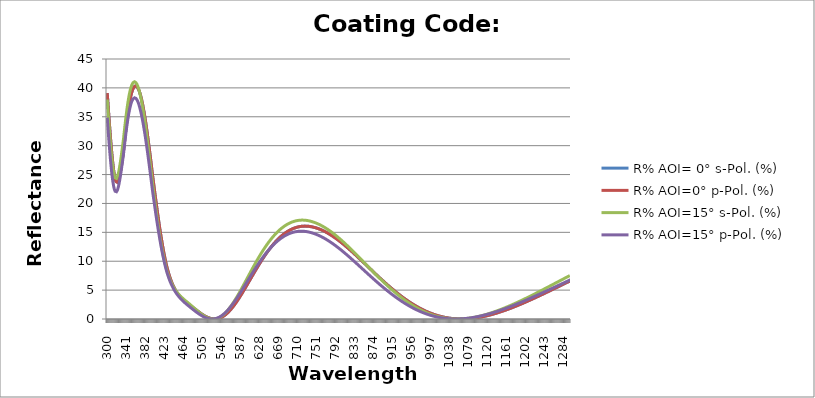
| Category | R% AOI= 0° s-Pol. (%) | R% AOI=0° p-Pol. (%) | R% AOI=15° s-Pol. (%) | R% AOI=15° p-Pol. (%) |
|---|---|---|---|---|
| 300.0 | 39.101 | 39.101 | 37.974 | 34.848 |
| 301.0 | 37.971 | 37.971 | 36.804 | 33.726 |
| 302.0 | 36.84 | 36.84 | 35.647 | 32.619 |
| 303.0 | 35.714 | 35.714 | 34.508 | 31.535 |
| 304.0 | 34.6 | 34.6 | 33.396 | 30.479 |
| 305.0 | 33.505 | 33.505 | 32.319 | 29.459 |
| 306.0 | 32.436 | 32.436 | 31.285 | 28.483 |
| 307.0 | 31.401 | 31.401 | 30.3 | 27.556 |
| 308.0 | 30.406 | 30.406 | 29.372 | 26.686 |
| 309.0 | 29.459 | 29.459 | 28.508 | 25.877 |
| 310.0 | 28.566 | 28.566 | 27.713 | 25.136 |
| 311.0 | 27.734 | 27.734 | 26.994 | 24.467 |
| 312.0 | 26.968 | 26.968 | 26.354 | 23.874 |
| 313.0 | 26.274 | 26.274 | 25.798 | 23.359 |
| 314.0 | 25.655 | 25.655 | 25.327 | 22.925 |
| 315.0 | 25.115 | 25.115 | 24.944 | 22.574 |
| 316.0 | 24.657 | 24.657 | 24.649 | 22.304 |
| 317.0 | 24.282 | 24.282 | 24.442 | 22.116 |
| 318.0 | 23.991 | 23.991 | 24.32 | 22.008 |
| 319.0 | 23.783 | 23.783 | 24.282 | 21.978 |
| 320.0 | 23.658 | 23.658 | 24.324 | 22.023 |
| 321.0 | 23.614 | 23.614 | 24.444 | 22.14 |
| 322.0 | 23.647 | 23.647 | 24.636 | 22.324 |
| 323.0 | 23.754 | 23.754 | 24.894 | 22.569 |
| 324.0 | 23.931 | 23.931 | 25.213 | 22.872 |
| 325.0 | 24.172 | 24.172 | 25.587 | 23.227 |
| 326.0 | 24.473 | 24.473 | 26.01 | 23.628 |
| 327.0 | 24.828 | 24.828 | 26.477 | 24.07 |
| 328.0 | 25.232 | 25.232 | 26.98 | 24.547 |
| 329.0 | 25.679 | 25.679 | 27.515 | 25.055 |
| 330.0 | 26.163 | 26.163 | 28.076 | 25.588 |
| 331.0 | 26.68 | 26.68 | 28.657 | 26.141 |
| 332.0 | 27.223 | 27.223 | 29.254 | 26.709 |
| 333.0 | 27.788 | 27.788 | 29.861 | 27.289 |
| 334.0 | 28.37 | 28.37 | 30.475 | 27.876 |
| 335.0 | 28.964 | 28.964 | 31.091 | 28.466 |
| 336.0 | 29.702 | 29.702 | 31.846 | 29.19 |
| 337.0 | 30.443 | 30.443 | 32.591 | 29.905 |
| 338.0 | 31.181 | 31.181 | 33.321 | 30.608 |
| 339.0 | 31.91 | 31.91 | 34.031 | 31.293 |
| 340.0 | 32.624 | 32.624 | 34.717 | 31.956 |
| 341.0 | 33.32 | 33.32 | 35.375 | 32.595 |
| 342.0 | 33.992 | 33.992 | 36.002 | 33.206 |
| 343.0 | 34.638 | 34.638 | 36.598 | 33.786 |
| 344.0 | 35.255 | 35.255 | 37.158 | 34.335 |
| 345.0 | 35.841 | 35.841 | 37.682 | 34.85 |
| 346.0 | 36.394 | 36.394 | 38.17 | 35.33 |
| 347.0 | 36.912 | 36.912 | 38.619 | 35.775 |
| 348.0 | 37.395 | 37.395 | 39.03 | 36.183 |
| 349.0 | 37.841 | 37.841 | 39.402 | 36.554 |
| 350.0 | 38.25 | 38.25 | 39.735 | 36.888 |
| 351.0 | 38.622 | 38.622 | 40.03 | 37.185 |
| 352.0 | 38.956 | 38.956 | 40.285 | 37.445 |
| 353.0 | 39.252 | 39.252 | 40.502 | 37.668 |
| 354.0 | 39.504 | 39.504 | 40.678 | 37.851 |
| 355.0 | 39.723 | 39.723 | 40.819 | 38.002 |
| 356.0 | 39.908 | 39.908 | 40.927 | 38.12 |
| 357.0 | 40.06 | 40.06 | 41.002 | 38.206 |
| 358.0 | 40.18 | 40.18 | 41.044 | 38.261 |
| 359.0 | 40.267 | 40.267 | 41.054 | 38.285 |
| 360.0 | 40.322 | 40.322 | 41.032 | 38.278 |
| 361.0 | 40.344 | 40.344 | 40.978 | 38.241 |
| 362.0 | 40.335 | 40.335 | 40.893 | 38.173 |
| 363.0 | 40.296 | 40.296 | 40.778 | 38.077 |
| 364.0 | 40.227 | 40.227 | 40.634 | 37.953 |
| 365.0 | 40.128 | 40.128 | 40.46 | 37.801 |
| 366.0 | 40.001 | 40.001 | 40.259 | 37.621 |
| 367.0 | 39.846 | 39.846 | 40.03 | 37.416 |
| 368.0 | 39.662 | 39.662 | 39.774 | 37.184 |
| 369.0 | 39.452 | 39.452 | 39.491 | 36.928 |
| 370.0 | 39.215 | 39.215 | 39.183 | 36.646 |
| 371.0 | 38.952 | 38.952 | 38.849 | 36.341 |
| 372.0 | 38.664 | 38.664 | 38.492 | 36.013 |
| 373.0 | 38.351 | 38.351 | 38.11 | 35.662 |
| 374.0 | 38.014 | 38.014 | 37.705 | 35.29 |
| 375.0 | 37.654 | 37.654 | 37.278 | 34.896 |
| 376.0 | 37.27 | 37.27 | 36.829 | 34.482 |
| 377.0 | 36.865 | 36.865 | 36.36 | 34.049 |
| 378.0 | 36.438 | 36.438 | 35.87 | 33.596 |
| 379.0 | 35.991 | 35.991 | 35.36 | 33.126 |
| 380.0 | 35.524 | 35.524 | 34.833 | 32.639 |
| 381.0 | 35.037 | 35.037 | 34.288 | 32.135 |
| 382.0 | 34.532 | 34.532 | 33.725 | 31.616 |
| 383.0 | 34.009 | 34.009 | 33.147 | 31.082 |
| 384.0 | 33.47 | 33.47 | 32.554 | 30.534 |
| 385.0 | 32.915 | 32.915 | 31.948 | 29.975 |
| 386.0 | 32.345 | 32.345 | 31.329 | 29.404 |
| 387.0 | 31.761 | 31.761 | 30.698 | 28.823 |
| 388.0 | 31.164 | 31.164 | 30.057 | 28.232 |
| 389.0 | 30.556 | 30.556 | 29.407 | 27.633 |
| 390.0 | 29.937 | 29.937 | 28.748 | 27.026 |
| 391.0 | 29.307 | 29.307 | 28.082 | 26.413 |
| 392.0 | 28.669 | 28.669 | 27.41 | 25.794 |
| 393.0 | 28.023 | 28.023 | 26.733 | 25.171 |
| 394.0 | 27.37 | 27.37 | 26.052 | 24.545 |
| 395.0 | 26.712 | 26.712 | 25.369 | 23.916 |
| 396.0 | 26.049 | 26.049 | 24.684 | 23.287 |
| 397.0 | 25.382 | 25.382 | 23.999 | 22.657 |
| 398.0 | 24.713 | 24.713 | 23.315 | 22.028 |
| 399.0 | 24.096 | 24.096 | 22.687 | 21.452 |
| 400.0 | 23.479 | 23.479 | 22.063 | 20.879 |
| 401.0 | 22.862 | 22.862 | 21.442 | 20.309 |
| 402.0 | 22.248 | 22.248 | 20.826 | 19.743 |
| 403.0 | 21.636 | 21.636 | 20.216 | 19.183 |
| 404.0 | 21.028 | 21.028 | 19.612 | 18.628 |
| 405.0 | 20.425 | 20.425 | 19.017 | 18.08 |
| 406.0 | 19.827 | 19.827 | 18.429 | 17.54 |
| 407.0 | 19.235 | 19.235 | 17.851 | 17.007 |
| 408.0 | 18.65 | 18.65 | 17.282 | 16.482 |
| 409.0 | 18.073 | 18.073 | 16.724 | 15.967 |
| 410.0 | 17.504 | 17.504 | 16.176 | 15.461 |
| 411.0 | 16.945 | 16.945 | 15.64 | 14.965 |
| 412.0 | 16.394 | 16.394 | 15.116 | 14.479 |
| 413.0 | 15.854 | 15.854 | 14.604 | 14.004 |
| 414.0 | 15.325 | 15.325 | 14.105 | 13.54 |
| 415.0 | 14.807 | 14.807 | 13.62 | 13.087 |
| 416.0 | 14.301 | 14.301 | 13.147 | 12.646 |
| 417.0 | 13.806 | 13.806 | 12.689 | 12.217 |
| 418.0 | 13.324 | 13.324 | 12.244 | 11.8 |
| 419.0 | 12.855 | 12.855 | 11.813 | 11.395 |
| 420.0 | 12.398 | 12.398 | 11.397 | 11.002 |
| 421.0 | 11.955 | 11.955 | 10.994 | 10.622 |
| 422.0 | 11.525 | 11.525 | 10.606 | 10.254 |
| 423.0 | 11.108 | 11.108 | 10.232 | 9.898 |
| 424.0 | 10.705 | 10.705 | 9.871 | 9.554 |
| 425.0 | 10.316 | 10.316 | 9.525 | 9.222 |
| 426.0 | 9.939 | 9.939 | 9.192 | 8.902 |
| 427.0 | 9.574 | 9.574 | 8.87 | 8.591 |
| 428.0 | 9.221 | 9.221 | 8.561 | 8.292 |
| 429.0 | 8.906 | 8.906 | 8.288 | 8.026 |
| 430.0 | 8.604 | 8.604 | 8.026 | 7.77 |
| 431.0 | 8.312 | 8.312 | 7.776 | 7.524 |
| 432.0 | 8.032 | 8.032 | 7.537 | 7.287 |
| 433.0 | 7.764 | 7.764 | 7.308 | 7.06 |
| 434.0 | 7.506 | 7.506 | 7.089 | 6.842 |
| 435.0 | 7.259 | 7.259 | 6.88 | 6.633 |
| 436.0 | 7.023 | 7.023 | 6.681 | 6.432 |
| 437.0 | 6.797 | 6.797 | 6.491 | 6.24 |
| 438.0 | 6.58 | 6.58 | 6.31 | 6.055 |
| 439.0 | 6.374 | 6.374 | 6.137 | 5.878 |
| 440.0 | 6.176 | 6.176 | 5.972 | 5.708 |
| 441.0 | 5.987 | 5.987 | 5.815 | 5.546 |
| 442.0 | 5.807 | 5.807 | 5.665 | 5.39 |
| 443.0 | 5.635 | 5.635 | 5.522 | 5.24 |
| 444.0 | 5.47 | 5.47 | 5.385 | 5.096 |
| 445.0 | 5.314 | 5.314 | 5.255 | 4.958 |
| 446.0 | 5.164 | 5.164 | 5.13 | 4.826 |
| 447.0 | 5.021 | 5.021 | 5.011 | 4.698 |
| 448.0 | 4.884 | 4.884 | 4.896 | 4.576 |
| 449.0 | 4.754 | 4.754 | 4.787 | 4.458 |
| 450.0 | 4.629 | 4.629 | 4.681 | 4.344 |
| 451.0 | 4.509 | 4.509 | 4.58 | 4.234 |
| 452.0 | 4.395 | 4.395 | 4.482 | 4.128 |
| 453.0 | 4.285 | 4.285 | 4.387 | 4.025 |
| 454.0 | 4.179 | 4.179 | 4.295 | 3.925 |
| 455.0 | 4.078 | 4.078 | 4.207 | 3.828 |
| 456.0 | 3.98 | 3.98 | 4.121 | 3.735 |
| 457.0 | 3.886 | 3.886 | 4.037 | 3.643 |
| 458.0 | 3.796 | 3.796 | 3.955 | 3.554 |
| 459.0 | 3.708 | 3.708 | 3.875 | 3.468 |
| 460.0 | 3.623 | 3.623 | 3.797 | 3.383 |
| 461.0 | 3.541 | 3.541 | 3.72 | 3.3 |
| 462.0 | 3.461 | 3.461 | 3.645 | 3.219 |
| 463.0 | 3.383 | 3.383 | 3.57 | 3.139 |
| 464.0 | 3.307 | 3.307 | 3.496 | 3.06 |
| 465.0 | 3.233 | 3.233 | 3.423 | 2.983 |
| 466.0 | 3.166 | 3.166 | 3.357 | 2.913 |
| 467.0 | 3.1 | 3.1 | 3.291 | 2.843 |
| 468.0 | 3.035 | 3.035 | 3.225 | 2.774 |
| 469.0 | 2.971 | 2.971 | 3.159 | 2.706 |
| 470.0 | 2.908 | 2.908 | 3.093 | 2.638 |
| 471.0 | 2.845 | 2.845 | 3.026 | 2.57 |
| 472.0 | 2.782 | 2.782 | 2.96 | 2.503 |
| 473.0 | 2.72 | 2.72 | 2.894 | 2.436 |
| 474.0 | 2.658 | 2.658 | 2.827 | 2.369 |
| 475.0 | 2.597 | 2.597 | 2.759 | 2.303 |
| 476.0 | 2.535 | 2.535 | 2.692 | 2.237 |
| 477.0 | 2.474 | 2.474 | 2.624 | 2.171 |
| 478.0 | 2.412 | 2.412 | 2.556 | 2.105 |
| 479.0 | 2.351 | 2.351 | 2.488 | 2.039 |
| 480.0 | 2.289 | 2.289 | 2.419 | 1.974 |
| 481.0 | 2.228 | 2.228 | 2.35 | 1.909 |
| 482.0 | 2.166 | 2.166 | 2.28 | 1.844 |
| 483.0 | 2.105 | 2.105 | 2.211 | 1.779 |
| 484.0 | 2.043 | 2.043 | 2.141 | 1.715 |
| 485.0 | 1.981 | 1.981 | 2.071 | 1.651 |
| 486.0 | 1.92 | 1.92 | 2.001 | 1.587 |
| 487.0 | 1.858 | 1.858 | 1.931 | 1.524 |
| 488.0 | 1.796 | 1.796 | 1.861 | 1.461 |
| 489.0 | 1.734 | 1.734 | 1.791 | 1.398 |
| 490.0 | 1.673 | 1.673 | 1.722 | 1.337 |
| 491.0 | 1.612 | 1.612 | 1.653 | 1.276 |
| 492.0 | 1.552 | 1.552 | 1.584 | 1.216 |
| 493.0 | 1.491 | 1.491 | 1.516 | 1.156 |
| 494.0 | 1.431 | 1.431 | 1.448 | 1.098 |
| 495.0 | 1.371 | 1.371 | 1.38 | 1.04 |
| 496.0 | 1.311 | 1.311 | 1.313 | 0.983 |
| 497.0 | 1.252 | 1.252 | 1.247 | 0.926 |
| 498.0 | 1.193 | 1.193 | 1.182 | 0.871 |
| 499.0 | 1.135 | 1.135 | 1.117 | 0.817 |
| 500.0 | 1.078 | 1.078 | 1.054 | 0.764 |
| 501.0 | 1.021 | 1.021 | 0.991 | 0.713 |
| 502.0 | 0.965 | 0.965 | 0.93 | 0.662 |
| 503.0 | 0.91 | 0.91 | 0.87 | 0.613 |
| 504.0 | 0.856 | 0.856 | 0.811 | 0.565 |
| 505.0 | 0.802 | 0.802 | 0.753 | 0.519 |
| 506.0 | 0.75 | 0.75 | 0.697 | 0.474 |
| 507.0 | 0.699 | 0.699 | 0.642 | 0.431 |
| 508.0 | 0.649 | 0.649 | 0.59 | 0.39 |
| 509.0 | 0.601 | 0.601 | 0.538 | 0.35 |
| 510.0 | 0.554 | 0.554 | 0.489 | 0.312 |
| 511.0 | 0.509 | 0.509 | 0.443 | 0.277 |
| 512.0 | 0.465 | 0.465 | 0.398 | 0.244 |
| 513.0 | 0.424 | 0.424 | 0.356 | 0.212 |
| 514.0 | 0.383 | 0.383 | 0.315 | 0.183 |
| 515.0 | 0.344 | 0.344 | 0.277 | 0.155 |
| 516.0 | 0.308 | 0.308 | 0.241 | 0.13 |
| 517.0 | 0.272 | 0.272 | 0.207 | 0.106 |
| 518.0 | 0.239 | 0.239 | 0.176 | 0.085 |
| 519.0 | 0.208 | 0.208 | 0.147 | 0.066 |
| 520.0 | 0.178 | 0.178 | 0.12 | 0.05 |
| 521.0 | 0.151 | 0.151 | 0.096 | 0.035 |
| 522.0 | 0.125 | 0.125 | 0.075 | 0.023 |
| 523.0 | 0.102 | 0.102 | 0.056 | 0.014 |
| 524.0 | 0.081 | 0.081 | 0.04 | 0.007 |
| 525.0 | 0.062 | 0.062 | 0.027 | 0.002 |
| 526.0 | 0.046 | 0.046 | 0.017 | 0 |
| 527.0 | 0.032 | 0.032 | 0.009 | 0.001 |
| 528.0 | 0.021 | 0.021 | 0.005 | 0.004 |
| 529.0 | 0.012 | 0.012 | 0.003 | 0.01 |
| 530.0 | 0.005 | 0.005 | 0.005 | 0.018 |
| 531.0 | 0.001 | 0.001 | 0.01 | 0.029 |
| 532.0 | 0 | 0 | 0.017 | 0.043 |
| 533.0 | 0.001 | 0.001 | 0.028 | 0.06 |
| 534.0 | 0.005 | 0.005 | 0.042 | 0.079 |
| 535.0 | 0.012 | 0.012 | 0.059 | 0.101 |
| 536.0 | 0.022 | 0.022 | 0.08 | 0.126 |
| 537.0 | 0.034 | 0.034 | 0.103 | 0.153 |
| 538.0 | 0.049 | 0.049 | 0.13 | 0.183 |
| 539.0 | 0.067 | 0.067 | 0.16 | 0.216 |
| 540.0 | 0.087 | 0.087 | 0.193 | 0.252 |
| 541.0 | 0.111 | 0.111 | 0.23 | 0.291 |
| 542.0 | 0.137 | 0.137 | 0.269 | 0.332 |
| 543.0 | 0.166 | 0.166 | 0.312 | 0.376 |
| 544.0 | 0.198 | 0.198 | 0.358 | 0.423 |
| 545.0 | 0.233 | 0.233 | 0.408 | 0.473 |
| 546.0 | 0.271 | 0.271 | 0.46 | 0.525 |
| 547.0 | 0.312 | 0.312 | 0.516 | 0.58 |
| 548.0 | 0.355 | 0.355 | 0.575 | 0.638 |
| 549.0 | 0.402 | 0.402 | 0.637 | 0.698 |
| 550.0 | 0.451 | 0.451 | 0.702 | 0.761 |
| 551.0 | 0.503 | 0.503 | 0.77 | 0.826 |
| 552.0 | 0.558 | 0.558 | 0.841 | 0.894 |
| 553.0 | 0.616 | 0.616 | 0.915 | 0.965 |
| 554.0 | 0.676 | 0.676 | 0.993 | 1.038 |
| 555.0 | 0.739 | 0.739 | 1.073 | 1.114 |
| 556.0 | 0.805 | 0.805 | 1.156 | 1.192 |
| 557.0 | 0.874 | 0.874 | 1.242 | 1.272 |
| 558.0 | 0.945 | 0.945 | 1.331 | 1.354 |
| 559.0 | 1.019 | 1.019 | 1.422 | 1.44 |
| 560.0 | 1.096 | 1.096 | 1.516 | 1.527 |
| 561.0 | 1.175 | 1.175 | 1.613 | 1.616 |
| 562.0 | 1.256 | 1.256 | 1.713 | 1.708 |
| 563.0 | 1.341 | 1.341 | 1.815 | 1.802 |
| 564.0 | 1.427 | 1.427 | 1.92 | 1.898 |
| 565.0 | 1.516 | 1.516 | 2.026 | 1.995 |
| 566.0 | 1.607 | 1.607 | 2.135 | 2.094 |
| 567.0 | 1.7 | 1.7 | 2.246 | 2.195 |
| 568.0 | 1.795 | 1.795 | 2.36 | 2.298 |
| 569.0 | 1.892 | 1.892 | 2.475 | 2.403 |
| 570.0 | 1.991 | 1.991 | 2.592 | 2.509 |
| 571.0 | 2.093 | 2.093 | 2.711 | 2.616 |
| 572.0 | 2.196 | 2.196 | 2.832 | 2.726 |
| 573.0 | 2.301 | 2.301 | 2.955 | 2.836 |
| 574.0 | 2.408 | 2.408 | 3.08 | 2.949 |
| 575.0 | 2.517 | 2.517 | 3.206 | 3.063 |
| 576.0 | 2.628 | 2.628 | 3.334 | 3.178 |
| 577.0 | 2.741 | 2.741 | 3.464 | 3.294 |
| 578.0 | 2.855 | 2.855 | 3.596 | 3.412 |
| 579.0 | 2.971 | 2.971 | 3.729 | 3.532 |
| 580.0 | 3.088 | 3.088 | 3.863 | 3.652 |
| 581.0 | 3.207 | 3.207 | 3.999 | 3.773 |
| 582.0 | 3.328 | 3.328 | 4.136 | 3.896 |
| 583.0 | 3.45 | 3.45 | 4.275 | 4.019 |
| 584.0 | 3.573 | 3.573 | 4.415 | 4.144 |
| 585.0 | 3.698 | 3.698 | 4.555 | 4.269 |
| 586.0 | 3.824 | 3.824 | 4.697 | 4.395 |
| 587.0 | 3.951 | 3.951 | 4.84 | 4.522 |
| 588.0 | 4.079 | 4.079 | 4.984 | 4.65 |
| 589.0 | 4.208 | 4.208 | 5.128 | 4.778 |
| 590.0 | 4.338 | 4.338 | 5.274 | 4.907 |
| 591.0 | 4.469 | 4.469 | 5.42 | 5.036 |
| 592.0 | 4.601 | 4.601 | 5.567 | 5.166 |
| 593.0 | 4.734 | 4.734 | 5.714 | 5.297 |
| 594.0 | 4.868 | 4.868 | 5.862 | 5.428 |
| 595.0 | 5.002 | 5.002 | 6.01 | 5.559 |
| 596.0 | 5.137 | 5.137 | 6.159 | 5.691 |
| 597.0 | 5.273 | 5.273 | 6.308 | 5.822 |
| 598.0 | 5.409 | 5.409 | 6.458 | 5.955 |
| 599.0 | 5.546 | 5.546 | 6.607 | 6.087 |
| 600.0 | 5.683 | 5.683 | 6.757 | 6.219 |
| 601.0 | 5.82 | 5.82 | 6.907 | 6.351 |
| 602.0 | 5.958 | 5.958 | 7.057 | 6.484 |
| 603.0 | 6.096 | 6.096 | 7.207 | 6.616 |
| 604.0 | 6.234 | 6.234 | 7.357 | 6.748 |
| 605.0 | 6.373 | 6.373 | 7.507 | 6.88 |
| 606.0 | 6.511 | 6.511 | 7.657 | 7.012 |
| 607.0 | 6.65 | 6.65 | 7.806 | 7.143 |
| 608.0 | 6.789 | 6.789 | 7.955 | 7.275 |
| 609.0 | 6.927 | 6.927 | 8.104 | 7.406 |
| 610.0 | 7.066 | 7.066 | 8.253 | 7.536 |
| 611.0 | 7.204 | 7.204 | 8.401 | 7.666 |
| 612.0 | 7.342 | 7.342 | 8.548 | 7.796 |
| 613.0 | 7.48 | 7.48 | 8.696 | 7.926 |
| 614.0 | 7.618 | 7.618 | 8.842 | 8.055 |
| 615.0 | 7.756 | 7.756 | 8.988 | 8.183 |
| 616.0 | 7.893 | 7.893 | 9.134 | 8.311 |
| 617.0 | 8.029 | 8.029 | 9.279 | 8.438 |
| 618.0 | 8.166 | 8.166 | 9.423 | 8.564 |
| 619.0 | 8.301 | 8.301 | 9.566 | 8.69 |
| 620.0 | 8.437 | 8.437 | 9.708 | 8.815 |
| 621.0 | 8.571 | 8.571 | 9.85 | 8.939 |
| 622.0 | 8.705 | 8.705 | 9.991 | 9.063 |
| 623.0 | 8.839 | 8.839 | 10.131 | 9.186 |
| 624.0 | 8.972 | 8.972 | 10.27 | 9.308 |
| 625.0 | 9.104 | 9.104 | 10.408 | 9.429 |
| 626.0 | 9.235 | 9.235 | 10.545 | 9.549 |
| 627.0 | 9.366 | 9.366 | 10.681 | 9.668 |
| 628.0 | 9.496 | 9.496 | 10.816 | 9.786 |
| 629.0 | 9.625 | 9.625 | 10.95 | 9.904 |
| 630.0 | 9.753 | 9.753 | 11.083 | 10.02 |
| 631.0 | 9.88 | 9.88 | 11.215 | 10.135 |
| 632.0 | 10.007 | 10.007 | 11.345 | 10.249 |
| 633.0 | 10.132 | 10.132 | 11.474 | 10.362 |
| 634.0 | 10.256 | 10.256 | 11.603 | 10.474 |
| 635.0 | 10.38 | 10.38 | 11.729 | 10.586 |
| 636.0 | 10.502 | 10.502 | 11.855 | 10.695 |
| 637.0 | 10.624 | 10.624 | 11.979 | 10.804 |
| 638.0 | 10.744 | 10.744 | 12.102 | 10.912 |
| 639.0 | 10.863 | 10.863 | 12.224 | 11.018 |
| 640.0 | 10.981 | 10.981 | 12.344 | 11.123 |
| 641.0 | 11.098 | 11.098 | 12.463 | 11.227 |
| 642.0 | 11.214 | 11.214 | 12.581 | 11.33 |
| 643.0 | 11.329 | 11.329 | 12.697 | 11.431 |
| 644.0 | 11.442 | 11.442 | 12.812 | 11.531 |
| 645.0 | 11.554 | 11.554 | 12.925 | 11.63 |
| 646.0 | 11.665 | 11.665 | 13.037 | 11.728 |
| 647.0 | 11.775 | 11.775 | 13.148 | 11.824 |
| 648.0 | 11.883 | 11.883 | 13.257 | 11.92 |
| 649.0 | 11.991 | 11.991 | 13.365 | 12.014 |
| 650.0 | 12.097 | 12.097 | 13.471 | 12.106 |
| 651.0 | 12.201 | 12.201 | 13.576 | 12.198 |
| 652.0 | 12.305 | 12.305 | 13.679 | 12.287 |
| 653.0 | 12.407 | 12.407 | 13.78 | 12.376 |
| 654.0 | 12.507 | 12.507 | 13.881 | 12.463 |
| 655.0 | 12.607 | 12.607 | 13.98 | 12.549 |
| 656.0 | 12.705 | 12.705 | 14.077 | 12.634 |
| 657.0 | 12.802 | 12.802 | 14.172 | 12.717 |
| 658.0 | 12.897 | 12.897 | 14.267 | 12.799 |
| 659.0 | 12.991 | 12.991 | 14.359 | 12.879 |
| 660.0 | 13.084 | 13.084 | 14.45 | 12.958 |
| 661.0 | 13.175 | 13.175 | 14.54 | 13.036 |
| 662.0 | 13.265 | 13.265 | 14.628 | 13.112 |
| 663.0 | 13.353 | 13.353 | 14.714 | 13.187 |
| 664.0 | 13.44 | 13.44 | 14.799 | 13.261 |
| 665.0 | 13.526 | 13.526 | 14.883 | 13.333 |
| 666.0 | 13.61 | 13.61 | 14.964 | 13.404 |
| 667.0 | 13.693 | 13.693 | 15.045 | 13.473 |
| 668.0 | 13.774 | 13.774 | 15.123 | 13.541 |
| 669.0 | 13.854 | 13.854 | 15.2 | 13.608 |
| 670.0 | 13.933 | 13.933 | 15.276 | 13.673 |
| 671.0 | 14.01 | 14.01 | 15.35 | 13.737 |
| 672.0 | 14.086 | 14.086 | 15.422 | 13.799 |
| 673.0 | 14.16 | 14.16 | 15.493 | 13.86 |
| 674.0 | 14.233 | 14.233 | 15.562 | 13.92 |
| 675.0 | 14.304 | 14.304 | 15.63 | 13.978 |
| 676.0 | 14.374 | 14.374 | 15.696 | 14.034 |
| 677.0 | 14.442 | 14.442 | 15.761 | 14.09 |
| 678.0 | 14.51 | 14.51 | 15.824 | 14.144 |
| 679.0 | 14.575 | 14.575 | 15.885 | 14.196 |
| 680.0 | 14.639 | 14.639 | 15.945 | 14.247 |
| 681.0 | 14.702 | 14.702 | 16.003 | 14.297 |
| 682.0 | 14.763 | 14.763 | 16.06 | 14.345 |
| 683.0 | 14.823 | 14.823 | 16.115 | 14.392 |
| 684.0 | 14.881 | 14.881 | 16.169 | 14.438 |
| 685.0 | 14.938 | 14.938 | 16.221 | 14.482 |
| 686.0 | 14.993 | 14.993 | 16.271 | 14.525 |
| 687.0 | 15.047 | 15.047 | 16.32 | 14.566 |
| 688.0 | 15.1 | 15.1 | 16.368 | 14.606 |
| 689.0 | 15.151 | 15.151 | 16.414 | 14.645 |
| 690.0 | 15.2 | 15.2 | 16.458 | 14.682 |
| 691.0 | 15.249 | 15.249 | 16.501 | 14.718 |
| 692.0 | 15.295 | 15.295 | 16.543 | 14.753 |
| 693.0 | 15.341 | 15.341 | 16.582 | 14.786 |
| 694.0 | 15.385 | 15.385 | 16.621 | 14.818 |
| 695.0 | 15.427 | 15.427 | 16.658 | 14.848 |
| 696.0 | 15.468 | 15.468 | 16.693 | 14.878 |
| 697.0 | 15.508 | 15.508 | 16.727 | 14.906 |
| 698.0 | 15.547 | 15.547 | 16.76 | 14.932 |
| 699.0 | 15.584 | 15.584 | 16.791 | 14.957 |
| 700.0 | 15.619 | 15.619 | 16.82 | 14.981 |
| 701.0 | 15.653 | 15.653 | 16.848 | 15.004 |
| 702.0 | 15.686 | 15.686 | 16.875 | 15.025 |
| 703.0 | 15.717 | 15.717 | 16.9 | 15.045 |
| 704.0 | 15.747 | 15.747 | 16.924 | 15.064 |
| 705.0 | 15.776 | 15.776 | 16.946 | 15.081 |
| 706.0 | 15.803 | 15.803 | 16.967 | 15.098 |
| 707.0 | 15.829 | 15.829 | 16.987 | 15.112 |
| 708.0 | 15.854 | 15.854 | 17.005 | 15.126 |
| 709.0 | 15.877 | 15.877 | 17.022 | 15.138 |
| 710.0 | 15.899 | 15.899 | 17.037 | 15.15 |
| 711.0 | 15.92 | 15.92 | 17.051 | 15.16 |
| 712.0 | 15.939 | 15.939 | 17.063 | 15.168 |
| 713.0 | 15.957 | 15.957 | 17.074 | 15.176 |
| 714.0 | 15.974 | 15.974 | 17.084 | 15.182 |
| 715.0 | 15.989 | 15.989 | 17.093 | 15.187 |
| 716.0 | 16.003 | 16.003 | 17.1 | 15.191 |
| 717.0 | 16.016 | 16.016 | 17.106 | 15.194 |
| 718.0 | 16.027 | 16.027 | 17.11 | 15.195 |
| 719.0 | 16.038 | 16.038 | 17.114 | 15.195 |
| 720.0 | 16.047 | 16.047 | 17.116 | 15.194 |
| 721.0 | 16.054 | 16.054 | 17.116 | 15.192 |
| 722.0 | 16.061 | 16.061 | 17.116 | 15.189 |
| 723.0 | 16.066 | 16.066 | 17.114 | 15.185 |
| 724.0 | 16.07 | 16.07 | 17.11 | 15.18 |
| 725.0 | 16.073 | 16.073 | 17.106 | 15.173 |
| 726.0 | 16.075 | 16.075 | 17.1 | 15.166 |
| 727.0 | 16.075 | 16.075 | 17.093 | 15.157 |
| 728.0 | 16.075 | 16.075 | 17.085 | 15.147 |
| 729.0 | 16.073 | 16.073 | 17.076 | 15.136 |
| 730.0 | 16.07 | 16.07 | 17.065 | 15.124 |
| 731.0 | 16.065 | 16.065 | 17.054 | 15.111 |
| 732.0 | 16.06 | 16.06 | 17.04 | 15.097 |
| 733.0 | 16.053 | 16.053 | 17.026 | 15.081 |
| 734.0 | 16.046 | 16.046 | 17.011 | 15.065 |
| 735.0 | 16.037 | 16.037 | 16.995 | 15.048 |
| 736.0 | 16.027 | 16.027 | 16.977 | 15.029 |
| 737.0 | 16.015 | 16.015 | 16.958 | 15.01 |
| 738.0 | 16.003 | 16.003 | 16.938 | 14.99 |
| 739.0 | 15.99 | 15.99 | 16.917 | 14.968 |
| 740.0 | 15.976 | 15.976 | 16.895 | 14.946 |
| 741.0 | 15.96 | 15.96 | 16.872 | 14.923 |
| 742.0 | 15.943 | 15.943 | 16.848 | 14.898 |
| 743.0 | 15.926 | 15.926 | 16.822 | 14.873 |
| 744.0 | 15.907 | 15.907 | 16.796 | 14.847 |
| 745.0 | 15.887 | 15.887 | 16.768 | 14.82 |
| 746.0 | 15.866 | 15.866 | 16.74 | 14.792 |
| 747.0 | 15.846 | 15.846 | 16.711 | 14.764 |
| 748.0 | 15.825 | 15.825 | 16.682 | 14.735 |
| 749.0 | 15.802 | 15.802 | 16.652 | 14.706 |
| 750.0 | 15.779 | 15.779 | 16.621 | 14.676 |
| 751.0 | 15.754 | 15.754 | 16.588 | 14.644 |
| 752.0 | 15.729 | 15.729 | 16.555 | 14.612 |
| 753.0 | 15.702 | 15.702 | 16.521 | 14.579 |
| 754.0 | 15.675 | 15.675 | 16.486 | 14.546 |
| 755.0 | 15.647 | 15.647 | 16.45 | 14.511 |
| 756.0 | 15.618 | 15.618 | 16.413 | 14.475 |
| 757.0 | 15.587 | 15.587 | 16.375 | 14.439 |
| 758.0 | 15.556 | 15.556 | 16.336 | 14.402 |
| 759.0 | 15.524 | 15.524 | 16.296 | 14.364 |
| 760.0 | 15.492 | 15.492 | 16.255 | 14.325 |
| 761.0 | 15.458 | 15.458 | 16.214 | 14.286 |
| 762.0 | 15.423 | 15.423 | 16.171 | 14.245 |
| 763.0 | 15.388 | 15.388 | 16.128 | 14.204 |
| 764.0 | 15.351 | 15.351 | 16.084 | 14.162 |
| 765.0 | 15.314 | 15.314 | 16.039 | 14.12 |
| 766.0 | 15.276 | 15.276 | 15.993 | 14.077 |
| 767.0 | 15.237 | 15.237 | 15.946 | 14.033 |
| 768.0 | 15.198 | 15.198 | 15.898 | 13.988 |
| 769.0 | 15.157 | 15.157 | 15.85 | 13.942 |
| 770.0 | 15.116 | 15.116 | 15.801 | 13.896 |
| 771.0 | 15.074 | 15.074 | 15.751 | 13.849 |
| 772.0 | 15.031 | 15.031 | 15.7 | 13.802 |
| 773.0 | 14.987 | 14.987 | 15.649 | 13.754 |
| 774.0 | 14.943 | 14.943 | 15.596 | 13.705 |
| 775.0 | 14.898 | 14.898 | 15.544 | 13.655 |
| 776.0 | 14.852 | 14.852 | 15.49 | 13.605 |
| 777.0 | 14.805 | 14.805 | 15.435 | 13.554 |
| 778.0 | 14.758 | 14.758 | 15.38 | 13.503 |
| 779.0 | 14.71 | 14.71 | 15.324 | 13.451 |
| 780.0 | 14.661 | 14.661 | 15.268 | 13.398 |
| 781.0 | 14.611 | 14.611 | 15.21 | 13.345 |
| 782.0 | 14.561 | 14.561 | 15.152 | 13.291 |
| 783.0 | 14.51 | 14.51 | 15.093 | 13.236 |
| 784.0 | 14.459 | 14.459 | 15.034 | 13.181 |
| 785.0 | 14.406 | 14.406 | 14.974 | 13.126 |
| 786.0 | 14.354 | 14.354 | 14.913 | 13.07 |
| 787.0 | 14.3 | 14.3 | 14.852 | 13.013 |
| 788.0 | 14.246 | 14.246 | 14.79 | 12.956 |
| 789.0 | 14.191 | 14.191 | 14.728 | 12.898 |
| 790.0 | 14.136 | 14.136 | 14.664 | 12.84 |
| 791.0 | 14.08 | 14.08 | 14.601 | 12.781 |
| 792.0 | 14.023 | 14.023 | 14.536 | 12.722 |
| 793.0 | 13.966 | 13.966 | 14.471 | 12.662 |
| 794.0 | 13.908 | 13.908 | 14.406 | 12.602 |
| 795.0 | 13.849 | 13.849 | 14.34 | 12.541 |
| 796.0 | 13.79 | 13.79 | 14.273 | 12.48 |
| 797.0 | 13.731 | 13.731 | 14.206 | 12.418 |
| 798.0 | 13.671 | 13.671 | 14.138 | 12.356 |
| 799.0 | 13.61 | 13.61 | 14.07 | 12.293 |
| 800.0 | 13.549 | 13.549 | 14.002 | 12.23 |
| 801.0 | 13.487 | 13.487 | 13.932 | 12.167 |
| 802.0 | 13.425 | 13.425 | 13.863 | 12.103 |
| 803.0 | 13.362 | 13.362 | 13.792 | 12.038 |
| 804.0 | 13.299 | 13.299 | 13.722 | 11.974 |
| 805.0 | 13.236 | 13.236 | 13.651 | 11.909 |
| 806.0 | 13.171 | 13.171 | 13.579 | 11.843 |
| 807.0 | 13.107 | 13.107 | 13.507 | 11.778 |
| 808.0 | 13.042 | 13.042 | 13.434 | 11.711 |
| 809.0 | 12.976 | 12.976 | 13.362 | 11.645 |
| 810.0 | 12.91 | 12.91 | 13.288 | 11.578 |
| 811.0 | 12.844 | 12.844 | 13.214 | 11.511 |
| 812.0 | 12.777 | 12.777 | 13.14 | 11.443 |
| 813.0 | 12.71 | 12.71 | 13.066 | 11.376 |
| 814.0 | 12.642 | 12.642 | 12.991 | 11.307 |
| 815.0 | 12.574 | 12.574 | 12.916 | 11.239 |
| 816.0 | 12.506 | 12.506 | 12.84 | 11.17 |
| 817.0 | 12.437 | 12.437 | 12.764 | 11.101 |
| 818.0 | 12.368 | 12.368 | 12.688 | 11.032 |
| 819.0 | 12.298 | 12.298 | 12.611 | 10.962 |
| 820.0 | 12.228 | 12.228 | 12.534 | 10.893 |
| 821.0 | 12.158 | 12.158 | 12.457 | 10.822 |
| 822.0 | 12.088 | 12.088 | 12.379 | 10.752 |
| 823.0 | 12.017 | 12.017 | 12.302 | 10.682 |
| 824.0 | 11.945 | 11.945 | 12.223 | 10.611 |
| 825.0 | 11.874 | 11.874 | 12.145 | 10.54 |
| 826.0 | 11.802 | 11.802 | 12.066 | 10.469 |
| 827.0 | 11.73 | 11.73 | 11.987 | 10.397 |
| 828.0 | 11.658 | 11.658 | 11.908 | 10.326 |
| 829.0 | 11.585 | 11.585 | 11.828 | 10.254 |
| 830.0 | 11.512 | 11.512 | 11.749 | 10.182 |
| 831.0 | 11.439 | 11.439 | 11.669 | 10.11 |
| 832.0 | 11.366 | 11.366 | 11.589 | 10.038 |
| 833.0 | 11.292 | 11.292 | 11.508 | 9.966 |
| 834.0 | 11.218 | 11.218 | 11.428 | 9.893 |
| 835.0 | 11.144 | 11.144 | 11.347 | 9.82 |
| 836.0 | 11.069 | 11.069 | 11.266 | 9.748 |
| 837.0 | 10.995 | 10.995 | 11.185 | 9.674 |
| 838.0 | 10.92 | 10.92 | 11.104 | 9.602 |
| 839.0 | 10.845 | 10.845 | 11.022 | 9.528 |
| 840.0 | 10.77 | 10.77 | 10.941 | 9.455 |
| 841.0 | 10.695 | 10.695 | 10.859 | 9.382 |
| 842.0 | 10.619 | 10.619 | 10.778 | 9.308 |
| 843.0 | 10.544 | 10.544 | 10.696 | 9.235 |
| 844.0 | 10.468 | 10.468 | 10.614 | 9.161 |
| 845.0 | 10.392 | 10.392 | 10.532 | 9.088 |
| 846.0 | 10.316 | 10.316 | 10.449 | 9.014 |
| 847.0 | 10.24 | 10.24 | 10.367 | 8.94 |
| 848.0 | 10.164 | 10.164 | 10.285 | 8.867 |
| 849.0 | 10.087 | 10.087 | 10.202 | 8.793 |
| 850.0 | 10.011 | 10.011 | 10.12 | 8.719 |
| 851.0 | 9.934 | 9.934 | 10.037 | 8.646 |
| 852.0 | 9.858 | 9.858 | 9.954 | 8.572 |
| 853.0 | 9.781 | 9.781 | 9.872 | 8.498 |
| 854.0 | 9.704 | 9.704 | 9.789 | 8.424 |
| 855.0 | 9.627 | 9.627 | 9.707 | 8.351 |
| 856.0 | 9.55 | 9.55 | 9.624 | 8.277 |
| 857.0 | 9.474 | 9.474 | 9.542 | 8.203 |
| 858.0 | 9.397 | 9.397 | 9.459 | 8.13 |
| 859.0 | 9.32 | 9.32 | 9.376 | 8.056 |
| 860.0 | 9.243 | 9.243 | 9.294 | 7.983 |
| 861.0 | 9.166 | 9.166 | 9.212 | 7.91 |
| 862.0 | 9.089 | 9.089 | 9.129 | 7.836 |
| 863.0 | 9.012 | 9.012 | 9.047 | 7.763 |
| 864.0 | 8.935 | 8.935 | 8.964 | 7.69 |
| 865.0 | 8.858 | 8.858 | 8.882 | 7.617 |
| 866.0 | 8.781 | 8.781 | 8.8 | 7.544 |
| 867.0 | 8.704 | 8.704 | 8.718 | 7.471 |
| 868.0 | 8.627 | 8.627 | 8.636 | 7.398 |
| 869.0 | 8.55 | 8.55 | 8.554 | 7.326 |
| 870.0 | 8.474 | 8.474 | 8.472 | 7.253 |
| 871.0 | 8.397 | 8.397 | 8.39 | 7.181 |
| 872.0 | 8.32 | 8.32 | 8.308 | 7.108 |
| 873.0 | 8.244 | 8.244 | 8.227 | 7.036 |
| 874.0 | 8.167 | 8.167 | 8.146 | 6.964 |
| 875.0 | 8.091 | 8.091 | 8.064 | 6.892 |
| 876.0 | 8.014 | 8.014 | 7.983 | 6.821 |
| 877.0 | 7.938 | 7.938 | 7.902 | 6.749 |
| 878.0 | 7.862 | 7.862 | 7.822 | 6.678 |
| 879.0 | 7.786 | 7.786 | 7.741 | 6.607 |
| 880.0 | 7.71 | 7.71 | 7.66 | 6.536 |
| 881.0 | 7.634 | 7.634 | 7.58 | 6.465 |
| 882.0 | 7.558 | 7.558 | 7.5 | 6.394 |
| 883.0 | 7.483 | 7.483 | 7.42 | 6.324 |
| 884.0 | 7.408 | 7.408 | 7.34 | 6.254 |
| 885.0 | 7.332 | 7.332 | 7.261 | 6.184 |
| 886.0 | 7.257 | 7.257 | 7.182 | 6.114 |
| 887.0 | 7.182 | 7.182 | 7.102 | 6.044 |
| 888.0 | 7.108 | 7.108 | 7.024 | 5.975 |
| 889.0 | 7.034 | 7.034 | 6.946 | 5.906 |
| 890.0 | 6.96 | 6.96 | 6.868 | 5.838 |
| 891.0 | 6.886 | 6.886 | 6.79 | 5.77 |
| 892.0 | 6.813 | 6.813 | 6.713 | 5.702 |
| 893.0 | 6.74 | 6.74 | 6.636 | 5.635 |
| 894.0 | 6.666 | 6.666 | 6.559 | 5.567 |
| 895.0 | 6.594 | 6.594 | 6.482 | 5.5 |
| 896.0 | 6.521 | 6.521 | 6.406 | 5.433 |
| 897.0 | 6.449 | 6.449 | 6.33 | 5.367 |
| 898.0 | 6.376 | 6.376 | 6.254 | 5.3 |
| 899.0 | 6.304 | 6.304 | 6.179 | 5.234 |
| 900.0 | 6.233 | 6.233 | 6.104 | 5.169 |
| 901.0 | 6.161 | 6.161 | 6.029 | 5.103 |
| 902.0 | 6.09 | 6.09 | 5.954 | 5.038 |
| 903.0 | 6.019 | 6.019 | 5.88 | 4.973 |
| 904.0 | 5.948 | 5.948 | 5.806 | 4.909 |
| 905.0 | 5.878 | 5.878 | 5.733 | 4.844 |
| 906.0 | 5.808 | 5.808 | 5.659 | 4.78 |
| 907.0 | 5.738 | 5.738 | 5.586 | 4.717 |
| 908.0 | 5.668 | 5.668 | 5.514 | 4.654 |
| 909.0 | 5.598 | 5.598 | 5.441 | 4.59 |
| 910.0 | 5.529 | 5.529 | 5.369 | 4.528 |
| 911.0 | 5.461 | 5.461 | 5.298 | 4.466 |
| 912.0 | 5.392 | 5.392 | 5.226 | 4.404 |
| 913.0 | 5.324 | 5.324 | 5.156 | 4.342 |
| 914.0 | 5.256 | 5.256 | 5.085 | 4.28 |
| 915.0 | 5.188 | 5.188 | 5.015 | 4.22 |
| 916.0 | 5.121 | 5.121 | 4.945 | 4.159 |
| 917.0 | 5.054 | 5.054 | 4.876 | 4.099 |
| 918.0 | 4.987 | 4.987 | 4.806 | 4.039 |
| 919.0 | 4.921 | 4.921 | 4.738 | 3.979 |
| 920.0 | 4.855 | 4.855 | 4.67 | 3.92 |
| 921.0 | 4.789 | 4.789 | 4.602 | 3.861 |
| 922.0 | 4.724 | 4.724 | 4.534 | 3.803 |
| 923.0 | 4.659 | 4.659 | 4.467 | 3.745 |
| 924.0 | 4.594 | 4.594 | 4.4 | 3.687 |
| 925.0 | 4.53 | 4.53 | 4.334 | 3.63 |
| 926.0 | 4.466 | 4.466 | 4.268 | 3.573 |
| 927.0 | 4.403 | 4.403 | 4.203 | 3.516 |
| 928.0 | 4.339 | 4.339 | 4.138 | 3.46 |
| 929.0 | 4.277 | 4.277 | 4.073 | 3.404 |
| 930.0 | 4.214 | 4.214 | 4.009 | 3.349 |
| 931.0 | 4.152 | 4.152 | 3.946 | 3.294 |
| 932.0 | 4.09 | 4.09 | 3.882 | 3.239 |
| 933.0 | 4.029 | 4.029 | 3.819 | 3.185 |
| 934.0 | 3.968 | 3.968 | 3.757 | 3.132 |
| 935.0 | 3.908 | 3.908 | 3.695 | 3.078 |
| 936.0 | 3.848 | 3.848 | 3.634 | 3.025 |
| 937.0 | 3.788 | 3.788 | 3.573 | 2.973 |
| 938.0 | 3.728 | 3.728 | 3.512 | 2.921 |
| 939.0 | 3.669 | 3.669 | 3.452 | 2.869 |
| 940.0 | 3.611 | 3.611 | 3.392 | 2.818 |
| 941.0 | 3.553 | 3.553 | 3.333 | 2.767 |
| 942.0 | 3.495 | 3.495 | 3.274 | 2.717 |
| 943.0 | 3.438 | 3.438 | 3.216 | 2.667 |
| 944.0 | 3.381 | 3.381 | 3.158 | 2.617 |
| 945.0 | 3.324 | 3.324 | 3.101 | 2.568 |
| 946.0 | 3.268 | 3.268 | 3.044 | 2.52 |
| 947.0 | 3.213 | 3.213 | 2.988 | 2.471 |
| 948.0 | 3.158 | 3.158 | 2.932 | 2.424 |
| 949.0 | 3.103 | 3.103 | 2.877 | 2.376 |
| 950.0 | 3.049 | 3.049 | 2.822 | 2.33 |
| 951.0 | 2.995 | 2.995 | 2.768 | 2.283 |
| 952.0 | 2.942 | 2.942 | 2.714 | 2.237 |
| 953.0 | 2.888 | 2.888 | 2.661 | 2.192 |
| 954.0 | 2.836 | 2.836 | 2.608 | 2.147 |
| 955.0 | 2.784 | 2.784 | 2.556 | 2.102 |
| 956.0 | 2.732 | 2.732 | 2.504 | 2.058 |
| 957.0 | 2.681 | 2.681 | 2.453 | 2.014 |
| 958.0 | 2.63 | 2.63 | 2.402 | 1.971 |
| 959.0 | 2.58 | 2.58 | 2.352 | 1.928 |
| 960.0 | 2.53 | 2.53 | 2.302 | 1.886 |
| 961.0 | 2.481 | 2.481 | 2.253 | 1.844 |
| 962.0 | 2.432 | 2.432 | 2.204 | 1.803 |
| 963.0 | 2.384 | 2.384 | 2.156 | 1.762 |
| 964.0 | 2.336 | 2.336 | 2.108 | 1.722 |
| 965.0 | 2.288 | 2.288 | 2.061 | 1.682 |
| 966.0 | 2.242 | 2.242 | 2.014 | 1.642 |
| 967.0 | 2.195 | 2.195 | 1.968 | 1.603 |
| 968.0 | 2.149 | 2.149 | 1.923 | 1.564 |
| 969.0 | 2.103 | 2.103 | 1.878 | 1.526 |
| 970.0 | 2.058 | 2.058 | 1.833 | 1.489 |
| 971.0 | 2.014 | 2.014 | 1.789 | 1.452 |
| 972.0 | 1.97 | 1.97 | 1.746 | 1.415 |
| 973.0 | 1.926 | 1.926 | 1.703 | 1.379 |
| 974.0 | 1.883 | 1.883 | 1.661 | 1.343 |
| 975.0 | 1.84 | 1.84 | 1.619 | 1.308 |
| 976.0 | 1.798 | 1.798 | 1.578 | 1.273 |
| 977.0 | 1.756 | 1.756 | 1.537 | 1.239 |
| 978.0 | 1.715 | 1.715 | 1.497 | 1.205 |
| 979.0 | 1.674 | 1.674 | 1.457 | 1.172 |
| 980.0 | 1.634 | 1.634 | 1.418 | 1.139 |
| 981.0 | 1.594 | 1.594 | 1.379 | 1.106 |
| 982.0 | 1.555 | 1.555 | 1.341 | 1.075 |
| 983.0 | 1.516 | 1.516 | 1.304 | 1.043 |
| 984.0 | 1.478 | 1.478 | 1.267 | 1.012 |
| 985.0 | 1.44 | 1.44 | 1.231 | 0.982 |
| 986.0 | 1.403 | 1.403 | 1.195 | 0.952 |
| 987.0 | 1.366 | 1.366 | 1.159 | 0.922 |
| 988.0 | 1.33 | 1.33 | 1.125 | 0.893 |
| 989.0 | 1.294 | 1.294 | 1.09 | 0.865 |
| 990.0 | 1.259 | 1.259 | 1.057 | 0.837 |
| 991.0 | 1.224 | 1.224 | 1.024 | 0.809 |
| 992.0 | 1.19 | 1.19 | 0.991 | 0.782 |
| 993.0 | 1.156 | 1.156 | 0.959 | 0.756 |
| 994.0 | 1.123 | 1.123 | 0.927 | 0.729 |
| 995.0 | 1.09 | 1.09 | 0.896 | 0.704 |
| 996.0 | 1.058 | 1.058 | 0.866 | 0.678 |
| 997.0 | 1.026 | 1.026 | 0.836 | 0.654 |
| 998.0 | 0.995 | 0.995 | 0.807 | 0.63 |
| 999.0 | 0.964 | 0.964 | 0.778 | 0.606 |
| 1000.0 | 0.934 | 0.934 | 0.75 | 0.583 |
| 1001.0 | 0.904 | 0.904 | 0.722 | 0.56 |
| 1002.0 | 0.874 | 0.874 | 0.695 | 0.537 |
| 1003.0 | 0.846 | 0.846 | 0.668 | 0.516 |
| 1004.0 | 0.817 | 0.817 | 0.642 | 0.494 |
| 1005.0 | 0.79 | 0.79 | 0.617 | 0.473 |
| 1006.0 | 0.762 | 0.762 | 0.592 | 0.453 |
| 1007.0 | 0.736 | 0.736 | 0.567 | 0.433 |
| 1008.0 | 0.709 | 0.709 | 0.543 | 0.413 |
| 1009.0 | 0.683 | 0.683 | 0.52 | 0.394 |
| 1010.0 | 0.658 | 0.658 | 0.497 | 0.376 |
| 1011.0 | 0.633 | 0.633 | 0.475 | 0.358 |
| 1012.0 | 0.609 | 0.609 | 0.453 | 0.34 |
| 1013.0 | 0.585 | 0.585 | 0.432 | 0.323 |
| 1014.0 | 0.562 | 0.562 | 0.411 | 0.306 |
| 1015.0 | 0.539 | 0.539 | 0.391 | 0.29 |
| 1016.0 | 0.516 | 0.516 | 0.371 | 0.274 |
| 1017.0 | 0.495 | 0.495 | 0.352 | 0.259 |
| 1018.0 | 0.473 | 0.473 | 0.334 | 0.244 |
| 1019.0 | 0.452 | 0.452 | 0.316 | 0.23 |
| 1020.0 | 0.432 | 0.432 | 0.298 | 0.216 |
| 1021.0 | 0.412 | 0.412 | 0.281 | 0.202 |
| 1022.0 | 0.393 | 0.393 | 0.265 | 0.189 |
| 1023.0 | 0.374 | 0.374 | 0.249 | 0.176 |
| 1024.0 | 0.355 | 0.355 | 0.233 | 0.164 |
| 1025.0 | 0.337 | 0.337 | 0.218 | 0.153 |
| 1026.0 | 0.32 | 0.32 | 0.204 | 0.141 |
| 1027.0 | 0.303 | 0.303 | 0.19 | 0.131 |
| 1028.0 | 0.286 | 0.286 | 0.177 | 0.12 |
| 1029.0 | 0.27 | 0.27 | 0.164 | 0.11 |
| 1030.0 | 0.255 | 0.255 | 0.151 | 0.101 |
| 1031.0 | 0.24 | 0.24 | 0.14 | 0.092 |
| 1032.0 | 0.225 | 0.225 | 0.128 | 0.083 |
| 1033.0 | 0.211 | 0.211 | 0.117 | 0.075 |
| 1034.0 | 0.197 | 0.197 | 0.107 | 0.067 |
| 1035.0 | 0.184 | 0.184 | 0.097 | 0.06 |
| 1036.0 | 0.171 | 0.171 | 0.088 | 0.053 |
| 1037.0 | 0.159 | 0.159 | 0.079 | 0.047 |
| 1038.0 | 0.147 | 0.147 | 0.071 | 0.041 |
| 1039.0 | 0.136 | 0.136 | 0.063 | 0.035 |
| 1040.0 | 0.125 | 0.125 | 0.056 | 0.03 |
| 1041.0 | 0.115 | 0.115 | 0.049 | 0.026 |
| 1042.0 | 0.105 | 0.105 | 0.042 | 0.021 |
| 1043.0 | 0.095 | 0.095 | 0.037 | 0.017 |
| 1044.0 | 0.086 | 0.086 | 0.031 | 0.014 |
| 1045.0 | 0.078 | 0.078 | 0.026 | 0.011 |
| 1046.0 | 0.07 | 0.07 | 0.022 | 0.008 |
| 1047.0 | 0.062 | 0.062 | 0.018 | 0.006 |
| 1048.0 | 0.055 | 0.055 | 0.015 | 0.004 |
| 1049.0 | 0.048 | 0.048 | 0.012 | 0.003 |
| 1050.0 | 0.042 | 0.042 | 0.009 | 0.002 |
| 1051.0 | 0.036 | 0.036 | 0.007 | 0.001 |
| 1052.0 | 0.031 | 0.031 | 0.006 | 0.001 |
| 1053.0 | 0.026 | 0.026 | 0.004 | 0.002 |
| 1054.0 | 0.021 | 0.021 | 0.004 | 0.002 |
| 1055.0 | 0.017 | 0.017 | 0.004 | 0.003 |
| 1056.0 | 0.014 | 0.014 | 0.004 | 0.005 |
| 1057.0 | 0.01 | 0.01 | 0.004 | 0.006 |
| 1058.0 | 0.008 | 0.008 | 0.006 | 0.009 |
| 1059.0 | 0.005 | 0.005 | 0.007 | 0.011 |
| 1060.0 | 0.003 | 0.003 | 0.01 | 0.014 |
| 1061.0 | 0.002 | 0.002 | 0.012 | 0.018 |
| 1062.0 | 0.001 | 0.001 | 0.015 | 0.021 |
| 1063.0 | 0 | 0 | 0.018 | 0.026 |
| 1064.0 | 0 | 0 | 0.022 | 0.03 |
| 1065.0 | 0 | 0 | 0.027 | 0.035 |
| 1066.0 | 0.001 | 0.001 | 0.031 | 0.04 |
| 1067.0 | 0.002 | 0.002 | 0.036 | 0.046 |
| 1068.0 | 0.003 | 0.003 | 0.042 | 0.052 |
| 1069.0 | 0.005 | 0.005 | 0.048 | 0.058 |
| 1070.0 | 0.008 | 0.008 | 0.055 | 0.065 |
| 1071.0 | 0.01 | 0.01 | 0.062 | 0.072 |
| 1072.0 | 0.013 | 0.013 | 0.069 | 0.08 |
| 1073.0 | 0.017 | 0.017 | 0.076 | 0.087 |
| 1074.0 | 0.021 | 0.021 | 0.085 | 0.095 |
| 1075.0 | 0.025 | 0.025 | 0.093 | 0.104 |
| 1076.0 | 0.03 | 0.03 | 0.102 | 0.113 |
| 1077.0 | 0.035 | 0.035 | 0.111 | 0.122 |
| 1078.0 | 0.04 | 0.04 | 0.121 | 0.132 |
| 1079.0 | 0.046 | 0.046 | 0.131 | 0.142 |
| 1080.0 | 0.052 | 0.052 | 0.142 | 0.152 |
| 1081.0 | 0.059 | 0.059 | 0.153 | 0.162 |
| 1082.0 | 0.066 | 0.066 | 0.164 | 0.173 |
| 1083.0 | 0.073 | 0.073 | 0.176 | 0.184 |
| 1084.0 | 0.081 | 0.081 | 0.188 | 0.196 |
| 1085.0 | 0.089 | 0.089 | 0.201 | 0.208 |
| 1086.0 | 0.098 | 0.098 | 0.214 | 0.22 |
| 1087.0 | 0.106 | 0.106 | 0.227 | 0.233 |
| 1088.0 | 0.116 | 0.116 | 0.24 | 0.246 |
| 1089.0 | 0.125 | 0.125 | 0.254 | 0.259 |
| 1090.0 | 0.135 | 0.135 | 0.269 | 0.272 |
| 1091.0 | 0.145 | 0.145 | 0.284 | 0.286 |
| 1092.0 | 0.156 | 0.156 | 0.299 | 0.3 |
| 1093.0 | 0.167 | 0.167 | 0.314 | 0.315 |
| 1094.0 | 0.178 | 0.178 | 0.33 | 0.33 |
| 1095.0 | 0.19 | 0.19 | 0.346 | 0.345 |
| 1096.0 | 0.202 | 0.202 | 0.363 | 0.36 |
| 1097.0 | 0.215 | 0.215 | 0.38 | 0.376 |
| 1098.0 | 0.228 | 0.228 | 0.397 | 0.392 |
| 1099.0 | 0.241 | 0.241 | 0.415 | 0.408 |
| 1100.0 | 0.254 | 0.254 | 0.433 | 0.425 |
| 1101.0 | 0.268 | 0.268 | 0.451 | 0.442 |
| 1102.0 | 0.282 | 0.282 | 0.47 | 0.459 |
| 1103.0 | 0.296 | 0.296 | 0.488 | 0.476 |
| 1104.0 | 0.311 | 0.311 | 0.508 | 0.494 |
| 1105.0 | 0.326 | 0.326 | 0.528 | 0.512 |
| 1106.0 | 0.341 | 0.341 | 0.547 | 0.53 |
| 1107.0 | 0.357 | 0.357 | 0.567 | 0.548 |
| 1108.0 | 0.373 | 0.373 | 0.587 | 0.567 |
| 1109.0 | 0.389 | 0.389 | 0.608 | 0.586 |
| 1110.0 | 0.405 | 0.405 | 0.628 | 0.605 |
| 1111.0 | 0.422 | 0.422 | 0.65 | 0.624 |
| 1112.0 | 0.439 | 0.439 | 0.671 | 0.644 |
| 1113.0 | 0.456 | 0.456 | 0.693 | 0.663 |
| 1114.0 | 0.474 | 0.474 | 0.715 | 0.683 |
| 1115.0 | 0.491 | 0.491 | 0.737 | 0.704 |
| 1116.0 | 0.509 | 0.509 | 0.76 | 0.724 |
| 1117.0 | 0.528 | 0.528 | 0.783 | 0.745 |
| 1118.0 | 0.547 | 0.547 | 0.806 | 0.766 |
| 1119.0 | 0.566 | 0.566 | 0.83 | 0.788 |
| 1120.0 | 0.585 | 0.585 | 0.853 | 0.809 |
| 1121.0 | 0.604 | 0.604 | 0.877 | 0.831 |
| 1122.0 | 0.624 | 0.624 | 0.902 | 0.853 |
| 1123.0 | 0.644 | 0.644 | 0.926 | 0.875 |
| 1124.0 | 0.665 | 0.665 | 0.951 | 0.898 |
| 1125.0 | 0.686 | 0.686 | 0.976 | 0.92 |
| 1126.0 | 0.706 | 0.706 | 1.002 | 0.943 |
| 1127.0 | 0.728 | 0.728 | 1.027 | 0.967 |
| 1128.0 | 0.749 | 0.749 | 1.053 | 0.99 |
| 1129.0 | 0.771 | 0.771 | 1.08 | 1.014 |
| 1130.0 | 0.793 | 0.793 | 1.106 | 1.038 |
| 1131.0 | 0.815 | 0.815 | 1.133 | 1.062 |
| 1132.0 | 0.838 | 0.838 | 1.16 | 1.086 |
| 1133.0 | 0.86 | 0.86 | 1.187 | 1.11 |
| 1134.0 | 0.883 | 0.883 | 1.214 | 1.135 |
| 1135.0 | 0.906 | 0.906 | 1.242 | 1.16 |
| 1136.0 | 0.93 | 0.93 | 1.27 | 1.185 |
| 1137.0 | 0.954 | 0.954 | 1.298 | 1.21 |
| 1138.0 | 0.978 | 0.978 | 1.327 | 1.236 |
| 1139.0 | 1.002 | 1.002 | 1.355 | 1.262 |
| 1140.0 | 1.026 | 1.026 | 1.384 | 1.288 |
| 1141.0 | 1.051 | 1.051 | 1.413 | 1.314 |
| 1142.0 | 1.076 | 1.076 | 1.443 | 1.34 |
| 1143.0 | 1.101 | 1.101 | 1.472 | 1.367 |
| 1144.0 | 1.126 | 1.126 | 1.502 | 1.394 |
| 1145.0 | 1.152 | 1.152 | 1.532 | 1.42 |
| 1146.0 | 1.178 | 1.178 | 1.562 | 1.448 |
| 1147.0 | 1.204 | 1.204 | 1.593 | 1.475 |
| 1148.0 | 1.23 | 1.23 | 1.624 | 1.502 |
| 1149.0 | 1.256 | 1.256 | 1.654 | 1.53 |
| 1150.0 | 1.283 | 1.283 | 1.686 | 1.558 |
| 1151.0 | 1.31 | 1.31 | 1.717 | 1.586 |
| 1152.0 | 1.337 | 1.337 | 1.748 | 1.614 |
| 1153.0 | 1.364 | 1.364 | 1.78 | 1.642 |
| 1154.0 | 1.392 | 1.392 | 1.812 | 1.671 |
| 1155.0 | 1.42 | 1.42 | 1.844 | 1.7 |
| 1156.0 | 1.448 | 1.448 | 1.876 | 1.729 |
| 1157.0 | 1.476 | 1.476 | 1.909 | 1.758 |
| 1158.0 | 1.504 | 1.504 | 1.942 | 1.787 |
| 1159.0 | 1.533 | 1.533 | 1.974 | 1.816 |
| 1160.0 | 1.561 | 1.561 | 2.008 | 1.846 |
| 1161.0 | 1.59 | 1.59 | 2.041 | 1.876 |
| 1162.0 | 1.619 | 1.619 | 2.074 | 1.905 |
| 1163.0 | 1.649 | 1.649 | 2.108 | 1.935 |
| 1164.0 | 1.678 | 1.678 | 2.142 | 1.966 |
| 1165.0 | 1.708 | 1.708 | 2.176 | 1.996 |
| 1166.0 | 1.738 | 1.738 | 2.21 | 2.026 |
| 1167.0 | 1.768 | 1.768 | 2.244 | 2.057 |
| 1168.0 | 1.798 | 1.798 | 2.279 | 2.088 |
| 1169.0 | 1.828 | 1.828 | 2.313 | 2.118 |
| 1170.0 | 1.859 | 1.859 | 2.348 | 2.15 |
| 1171.0 | 1.889 | 1.889 | 2.383 | 2.181 |
| 1172.0 | 1.92 | 1.92 | 2.418 | 2.212 |
| 1173.0 | 1.951 | 1.951 | 2.454 | 2.243 |
| 1174.0 | 1.983 | 1.983 | 2.489 | 2.275 |
| 1175.0 | 2.014 | 2.014 | 2.525 | 2.307 |
| 1176.0 | 2.046 | 2.046 | 2.56 | 2.338 |
| 1177.0 | 2.077 | 2.077 | 2.596 | 2.37 |
| 1178.0 | 2.109 | 2.109 | 2.632 | 2.403 |
| 1179.0 | 2.141 | 2.141 | 2.668 | 2.435 |
| 1180.0 | 2.173 | 2.173 | 2.705 | 2.467 |
| 1181.0 | 2.206 | 2.206 | 2.741 | 2.5 |
| 1182.0 | 2.238 | 2.238 | 2.778 | 2.532 |
| 1183.0 | 2.271 | 2.271 | 2.815 | 2.565 |
| 1184.0 | 2.303 | 2.303 | 2.852 | 2.598 |
| 1185.0 | 2.336 | 2.336 | 2.889 | 2.631 |
| 1186.0 | 2.369 | 2.369 | 2.926 | 2.664 |
| 1187.0 | 2.402 | 2.402 | 2.963 | 2.697 |
| 1188.0 | 2.436 | 2.436 | 3.001 | 2.73 |
| 1189.0 | 2.469 | 2.469 | 3.038 | 2.764 |
| 1190.0 | 2.503 | 2.503 | 3.076 | 2.797 |
| 1191.0 | 2.537 | 2.537 | 3.114 | 2.831 |
| 1192.0 | 2.57 | 2.57 | 3.152 | 2.864 |
| 1193.0 | 2.604 | 2.604 | 3.19 | 2.898 |
| 1194.0 | 2.638 | 2.638 | 3.228 | 2.932 |
| 1195.0 | 2.673 | 2.673 | 3.266 | 2.966 |
| 1196.0 | 2.707 | 2.707 | 3.304 | 3 |
| 1197.0 | 2.742 | 2.742 | 3.343 | 3.034 |
| 1198.0 | 2.776 | 2.776 | 3.382 | 3.069 |
| 1199.0 | 2.811 | 2.811 | 3.42 | 3.103 |
| 1200.0 | 2.846 | 2.846 | 3.459 | 3.137 |
| 1201.0 | 2.881 | 2.881 | 3.498 | 3.172 |
| 1202.0 | 2.916 | 2.916 | 3.537 | 3.207 |
| 1203.0 | 2.951 | 2.951 | 3.576 | 3.241 |
| 1204.0 | 2.986 | 2.986 | 3.615 | 3.276 |
| 1205.0 | 3.022 | 3.022 | 3.654 | 3.311 |
| 1206.0 | 3.057 | 3.057 | 3.694 | 3.346 |
| 1207.0 | 3.093 | 3.093 | 3.733 | 3.381 |
| 1208.0 | 3.128 | 3.128 | 3.773 | 3.416 |
| 1209.0 | 3.164 | 3.164 | 3.813 | 3.451 |
| 1210.0 | 3.2 | 3.2 | 3.852 | 3.487 |
| 1211.0 | 3.236 | 3.236 | 3.892 | 3.522 |
| 1212.0 | 3.272 | 3.272 | 3.932 | 3.558 |
| 1213.0 | 3.308 | 3.308 | 3.972 | 3.593 |
| 1214.0 | 3.345 | 3.345 | 4.012 | 3.628 |
| 1215.0 | 3.381 | 3.381 | 4.052 | 3.664 |
| 1216.0 | 3.417 | 3.417 | 4.093 | 3.7 |
| 1217.0 | 3.454 | 3.454 | 4.133 | 3.736 |
| 1218.0 | 3.491 | 3.491 | 4.173 | 3.772 |
| 1219.0 | 3.527 | 3.527 | 4.214 | 3.807 |
| 1220.0 | 3.564 | 3.564 | 4.254 | 3.843 |
| 1221.0 | 3.601 | 3.601 | 4.295 | 3.879 |
| 1222.0 | 3.638 | 3.638 | 4.336 | 3.916 |
| 1223.0 | 3.675 | 3.675 | 4.376 | 3.952 |
| 1224.0 | 3.712 | 3.712 | 4.417 | 3.988 |
| 1225.0 | 3.749 | 3.749 | 4.458 | 4.024 |
| 1226.0 | 3.786 | 3.786 | 4.499 | 4.06 |
| 1227.0 | 3.824 | 3.824 | 4.54 | 4.097 |
| 1228.0 | 3.861 | 3.861 | 4.581 | 4.133 |
| 1229.0 | 3.899 | 3.899 | 4.622 | 4.17 |
| 1230.0 | 3.936 | 3.936 | 4.663 | 4.206 |
| 1231.0 | 3.974 | 3.974 | 4.704 | 4.243 |
| 1232.0 | 4.012 | 4.012 | 4.746 | 4.279 |
| 1233.0 | 4.049 | 4.049 | 4.787 | 4.316 |
| 1234.0 | 4.087 | 4.087 | 4.828 | 4.352 |
| 1235.0 | 4.125 | 4.125 | 4.87 | 4.389 |
| 1236.0 | 4.163 | 4.163 | 4.911 | 4.426 |
| 1237.0 | 4.201 | 4.201 | 4.953 | 4.463 |
| 1238.0 | 4.239 | 4.239 | 4.994 | 4.5 |
| 1239.0 | 4.277 | 4.277 | 5.036 | 4.536 |
| 1240.0 | 4.315 | 4.315 | 5.077 | 4.573 |
| 1241.0 | 4.353 | 4.353 | 5.119 | 4.61 |
| 1242.0 | 4.392 | 4.392 | 5.161 | 4.647 |
| 1243.0 | 4.43 | 4.43 | 5.202 | 4.684 |
| 1244.0 | 4.468 | 4.468 | 5.244 | 4.721 |
| 1245.0 | 4.507 | 4.507 | 5.286 | 4.758 |
| 1246.0 | 4.545 | 4.545 | 5.328 | 4.796 |
| 1247.0 | 4.584 | 4.584 | 5.37 | 4.833 |
| 1248.0 | 4.622 | 4.622 | 5.412 | 4.87 |
| 1249.0 | 4.661 | 4.661 | 5.454 | 4.907 |
| 1250.0 | 4.699 | 4.699 | 5.495 | 4.944 |
| 1251.0 | 4.738 | 4.738 | 5.537 | 4.981 |
| 1252.0 | 4.777 | 4.777 | 5.579 | 5.019 |
| 1253.0 | 4.815 | 4.815 | 5.621 | 5.056 |
| 1254.0 | 4.854 | 4.854 | 5.664 | 5.093 |
| 1255.0 | 4.893 | 4.893 | 5.706 | 5.13 |
| 1256.0 | 4.932 | 4.932 | 5.748 | 5.168 |
| 1257.0 | 4.971 | 4.971 | 5.79 | 5.205 |
| 1258.0 | 5.01 | 5.01 | 5.832 | 5.242 |
| 1259.0 | 5.048 | 5.048 | 5.874 | 5.28 |
| 1260.0 | 5.087 | 5.087 | 5.916 | 5.317 |
| 1261.0 | 5.126 | 5.126 | 5.958 | 5.355 |
| 1262.0 | 5.165 | 5.165 | 6 | 5.392 |
| 1263.0 | 5.204 | 5.204 | 6.043 | 5.43 |
| 1264.0 | 5.244 | 5.244 | 6.085 | 5.467 |
| 1265.0 | 5.283 | 5.283 | 6.127 | 5.504 |
| 1266.0 | 5.322 | 5.322 | 6.169 | 5.542 |
| 1267.0 | 5.361 | 5.361 | 6.212 | 5.579 |
| 1268.0 | 5.4 | 5.4 | 6.254 | 5.617 |
| 1269.0 | 5.439 | 5.439 | 6.296 | 5.654 |
| 1270.0 | 5.478 | 5.478 | 6.338 | 5.692 |
| 1271.0 | 5.517 | 5.517 | 6.38 | 5.729 |
| 1272.0 | 5.557 | 5.557 | 6.423 | 5.767 |
| 1273.0 | 5.596 | 5.596 | 6.465 | 5.804 |
| 1274.0 | 5.635 | 5.635 | 6.507 | 5.842 |
| 1275.0 | 5.674 | 5.674 | 6.549 | 5.879 |
| 1276.0 | 5.714 | 5.714 | 6.592 | 5.916 |
| 1277.0 | 5.753 | 5.753 | 6.634 | 5.954 |
| 1278.0 | 5.792 | 5.792 | 6.676 | 5.991 |
| 1279.0 | 5.831 | 5.831 | 6.718 | 6.029 |
| 1280.0 | 5.871 | 5.871 | 6.76 | 6.066 |
| 1281.0 | 5.91 | 5.91 | 6.803 | 6.104 |
| 1282.0 | 5.949 | 5.949 | 6.845 | 6.141 |
| 1283.0 | 5.989 | 5.989 | 6.887 | 6.179 |
| 1284.0 | 6.028 | 6.028 | 6.929 | 6.216 |
| 1285.0 | 6.067 | 6.067 | 6.971 | 6.254 |
| 1286.0 | 6.106 | 6.106 | 7.014 | 6.291 |
| 1287.0 | 6.146 | 6.146 | 7.056 | 6.328 |
| 1288.0 | 6.185 | 6.185 | 7.098 | 6.366 |
| 1289.0 | 6.224 | 6.224 | 7.14 | 6.403 |
| 1290.0 | 6.264 | 6.264 | 7.182 | 6.44 |
| 1291.0 | 6.303 | 6.303 | 7.224 | 6.478 |
| 1292.0 | 6.342 | 6.342 | 7.266 | 6.515 |
| 1293.0 | 6.382 | 6.382 | 7.308 | 6.552 |
| 1294.0 | 6.421 | 6.421 | 7.35 | 6.59 |
| 1295.0 | 6.46 | 6.46 | 7.392 | 6.627 |
| 1296.0 | 6.499 | 6.499 | 7.434 | 6.664 |
| 1297.0 | 6.539 | 6.539 | 7.476 | 6.702 |
| 1298.0 | 6.578 | 6.578 | 7.518 | 6.739 |
| 1299.0 | 6.617 | 6.617 | 7.56 | 6.776 |
| 1300.0 | 6.656 | 6.656 | 7.602 | 6.813 |